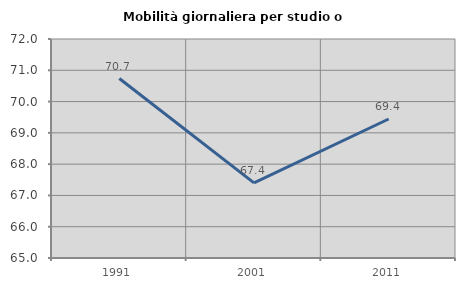
| Category | Mobilità giornaliera per studio o lavoro |
|---|---|
| 1991.0 | 70.736 |
| 2001.0 | 67.4 |
| 2011.0 | 69.443 |